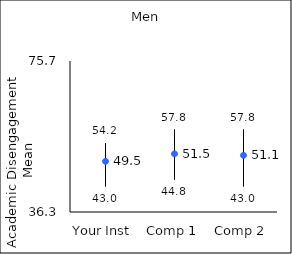
| Category | 25th percentile | 75th percentile | Mean |
|---|---|---|---|
| Your Inst | 43 | 54.2 | 49.51 |
| Comp 1 | 44.8 | 57.8 | 51.47 |
| Comp 2 | 43 | 57.8 | 51.09 |